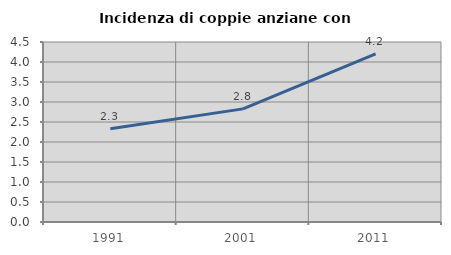
| Category | Incidenza di coppie anziane con figli |
|---|---|
| 1991.0 | 2.332 |
| 2001.0 | 2.828 |
| 2011.0 | 4.205 |